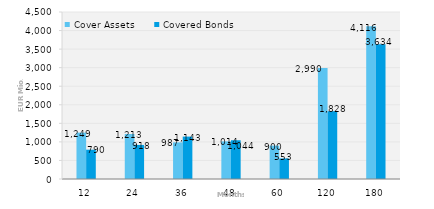
| Category | Cover Assets | Covered Bonds |
|---|---|---|
| 12.0 | 1249.458 | 790.085 |
| 24.0 | 1212.71 | 918.1 |
| 36.0 | 986.918 | 1142.914 |
| 48.0 | 1014.028 | 1044.092 |
| 60.0 | 899.702 | 553.464 |
| 120.0 | 2989.501 | 1827.798 |
| 180.0 | 4115.522 | 3633.606 |